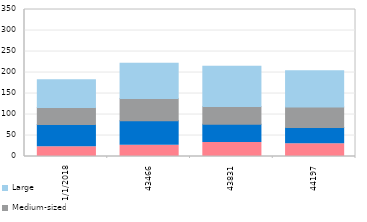
| Category | Micro | Small | Medium-sized | Large |
|---|---|---|---|---|
| 1/1/18 | 23.458 | 52.774 | 40.183 | 66.517 |
| nan | 25.544 | 54.802 | 52.603 | 77.229 |
| nan | 28.673 | 54.873 | 42.484 | 103.899 |
| nan | 37.41 | 70.984 | 51.038 | 152.215 |
| 1/1/19 | 26.913 | 58.293 | 53.033 | 83.702 |
| nan | 35.763 | 61.475 | 78.723 | 111.897 |
| nan | 27.759 | 70.634 | 86.103 | 106.825 |
| nan | 44.489 | 62.561 | 59.132 | 108.665 |
| 1/1/20 | 33.497 | 43.549 | 42.255 | 95.672 |
| nan | 32.96 | 54.335 | 59 | 72.028 |
| nan | 25.293 | 59.78 | 76.792 | 86.501 |
| nan | 37.626 | 49.063 | 68.305 | 103.2 |
| 1/1/21 | 30.617 | 38.71 | 48.392 | 86.375 |